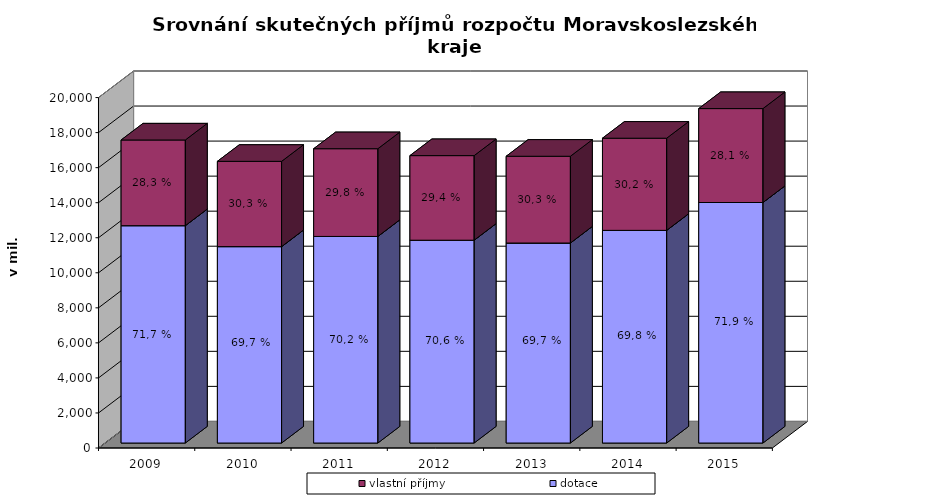
| Category | dotace | vlastní příjmy |
|---|---|---|
| 2009.0 | 12404.835 | 4890.252 |
| 2010.0 | 11209.286 | 4866.207 |
| 2011.0 | 11790.804 | 5006.023 |
| 2012.0 | 11574.909 | 4827.907 |
| 2013.0 | 11415.746 | 4951.1 |
| 2014.0 | 12137.583 | 5259.023 |
| 2015.0 | 13726.48 | 5360.395 |